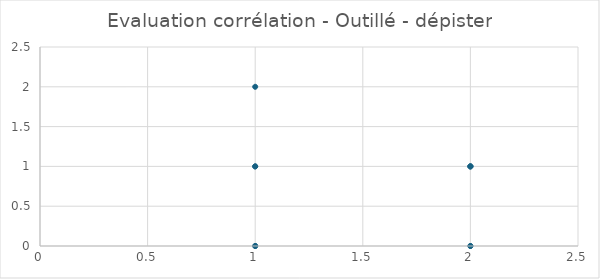
| Category | Series 0 |
|---|---|
| 2.0 | 0 |
| 1.0 | 2 |
| 2.0 | 0 |
| 1.0 | 0 |
| 2.0 | 1 |
| 1.0 | 1 |
| 1.0 | 0 |
| 1.0 | 1 |
| 2.0 | 1 |
| 2.0 | 1 |